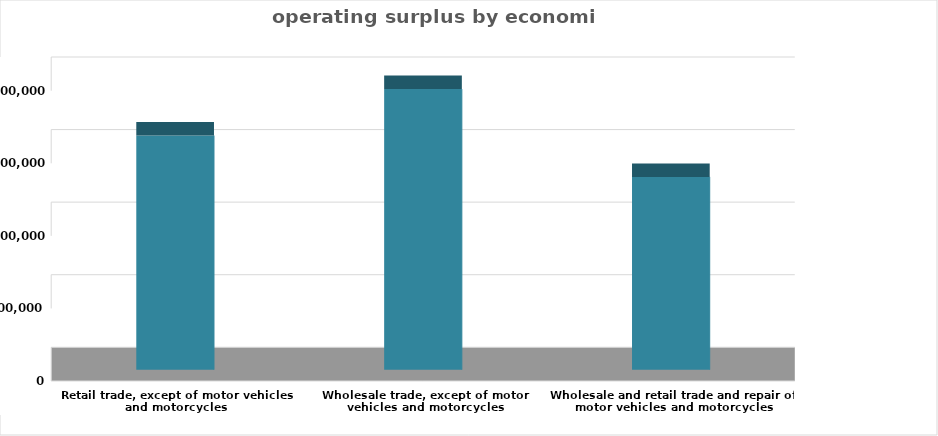
| Category | Series 0 |
|---|---|
| Wholesale and retail trade and repair of motor vehicles and motorcycles | 13288434375 |
| Wholesale trade, except of motor vehicles and motorcycles | 19338482477 |
| Retail trade, except of motor vehicles and motorcycles | 16138734129 |